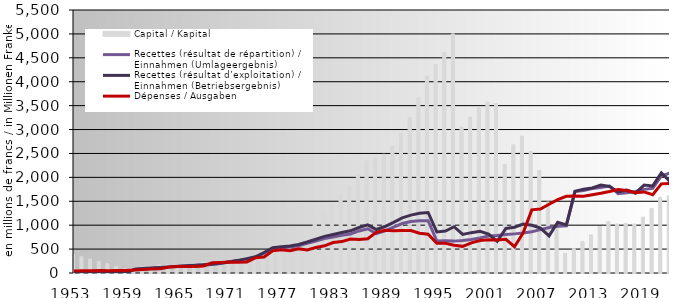
| Category | Capital / Kapital |
|---|---|
| 1953.0 | 389.9 |
| 1954.0 | 340.2 |
| 1955.0 | 292.1 |
| 1956.0 | 241.4 |
| 1957.0 | 195.7 |
| 1958.0 | 141.9 |
| 1959.0 | 88.171 |
| 1960.0 | 102.036 |
| 1961.0 | 122.244 |
| 1962.0 | 141.022 |
| 1963.0 | 168.882 |
| 1964.0 | 170.507 |
| 1965.0 | 173.189 |
| 1966.0 | 184.912 |
| 1967.0 | 209.614 |
| 1968.0 | 235.177 |
| 1969.0 | 208.393 |
| 1970.0 | 193.73 |
| 1971.0 | 199.083 |
| 1972.0 | 236.874 |
| 1973.0 | 305.813 |
| 1974.0 | 329.454 |
| 1975.0 | 423.949 |
| 1976.0 | 490.799 |
| 1977.0 | 552.342 |
| 1978.0 | 651.664 |
| 1979.0 | 738.918 |
| 1980.0 | 904.448 |
| 1981.0 | 1075.686 |
| 1982.0 | 1273.549 |
| 1983.0 | 1442.433 |
| 1984.0 | 1631.463 |
| 1985.0 | 1802.882 |
| 1986.0 | 2052.554 |
| 1987.0 | 2342.449 |
| 1988.0 | 2402.795 |
| 1989.0 | 2482.853 |
| 1990.0 | 2657.44 |
| 1991.0 | 2920.749 |
| 1992.0 | 3243.172 |
| 1993.0 | 3662.393 |
| 1994.0 | 4118.24 |
| 1995.0 | 4357.192 |
| 1996.0 | 4613.425 |
| 1997.0 | 5000.068 |
| 1998.0 | 3050.745 |
| 1999.0 | 3263.496 |
| 2000.0 | 3455.009 |
| 2001.0 | 3574.612 |
| 2002.0 | 3544.549 |
| 2003.0 | 2273.544 |
| 2004.0 | 2679.579 |
| 2005.0 | 2861.95 |
| 2006.0 | 2540.552 |
| 2007.0 | 2143.461 |
| 2008.0 | 1482.646 |
| 2009.0 | 1009.019 |
| 2010.0 | 411.832 |
| 2011.0 | 509.099 |
| 2012.0 | 656.84 |
| 2013.0 | 797.933 |
| 2014.0 | 967.769 |
| 2015.0 | 1075.638 |
| 2016.0 | 1024.023 |
| 2017.0 | 1036.432 |
| 2018.0 | 1024.598 |
| 2019.0 | 1166.88 |
| 2020.0 | 1350.699 |
| 2021.0 | 1581.769 |
| 2022.0 | 1614.843 |